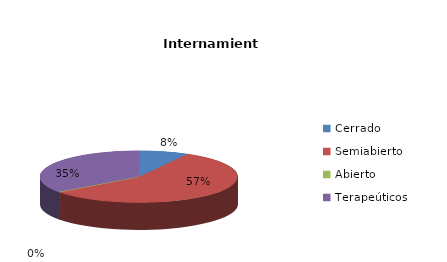
| Category | Series 0 |
|---|---|
| Cerrado | 6 |
| Semiabierto | 42 |
| Abierto | 0 |
| Terapeúticos | 26 |